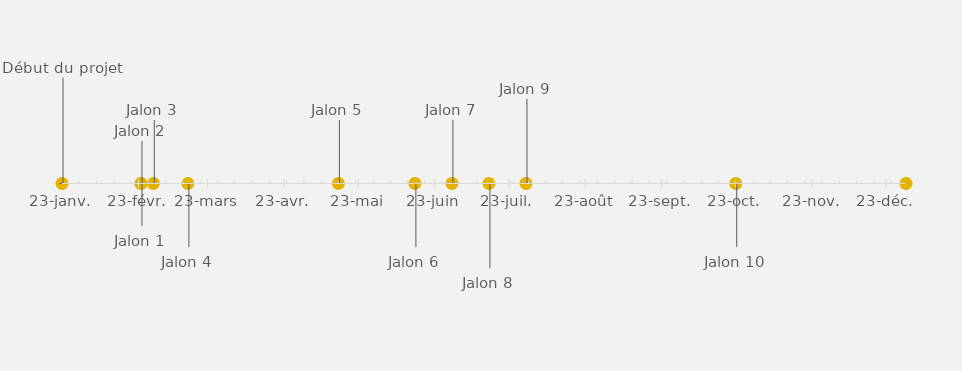
| Category | POSITION |
|---|---|
| Début du projet | 25 |
| Jalon 1 | -10 |
| Jalon 2 | 10 |
| Jalon 3 | 15 |
| Jalon 4 | -15 |
| Jalon 5 | 15 |
| Jalon 6 | -15 |
| Jalon 7 | 15 |
| Jalon 8 | -20 |
| Jalon 9 | 20 |
| Jalon 10 | -15 |
| Fin du projet | 15 |